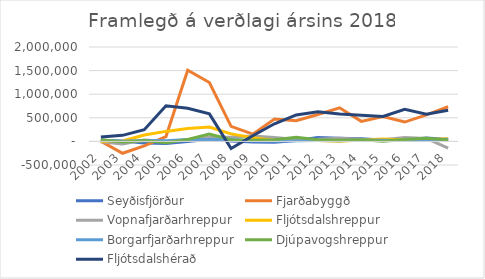
| Category | Seyðisfjörður | Fjarðabyggð | Vopnafjarðarhreppur | Fljótsdalshreppur | Borgarfjarðarhreppur | Djúpavogshreppur | Fljótsdalshérað |
|---|---|---|---|---|---|---|---|
| 2002.0 | 17354.318 | 4823.822 | -6658.55 | 2231.094 | 23784.038 | 35180.598 | 95485.526 |
| 2003.0 | 6314.777 | -251054.402 | -54485.96 | 10732.72 | 5642.481 | -10036.414 | 127752.179 |
| 2004.0 | -34464.767 | -95209.453 | 29319.673 | 135476.506 | 18380.046 | 16348.373 | 246776.496 |
| 2005.0 | -45670.043 | 102176.288 | -4628.116 | 212032.567 | 15030.199 | -26170.098 | 753470.011 |
| 2006.0 | -2495.641 | 1507216.973 | 27265.312 | 271005.652 | 38040.198 | 39319.432 | 702086.592 |
| 2007.0 | 45061.258 | 1248175.918 | 87415.651 | 304875.521 | 32723.334 | 156966.651 | 582424.823 |
| 2008.0 | 8624.498 | 319937.093 | 92235.568 | 158810.484 | 39213.013 | 37174.764 | -150115.039 |
| 2009.0 | -13492.224 | 152802.77 | 115450.043 | 79820.963 | 14912.319 | 23816.95 | 120449.411 |
| 2010.0 | -16789.533 | 475584.059 | 80211.093 | 21570.443 | 6890.871 | 36063.436 | 372676.794 |
| 2011.0 | 19257.655 | 439567.752 | 39129.417 | 34905.328 | 13421.034 | 89749.093 | 561248.728 |
| 2012.0 | 83760.812 | 570577.679 | 45914.996 | 20748.175 | 16708.434 | 35924.965 | 628655.399 |
| 2013.0 | 65317.303 | 710812.617 | 65024.168 | 5073.659 | 12141.959 | 23129.01 | 580381.884 |
| 2014.0 | 54868.688 | 423806.422 | 43473.307 | 29662.983 | 28196.304 | 37479.149 | 555195.129 |
| 2015.0 | 30674.56 | 525218.554 | 36386.125 | 50199.081 | 23278.747 | 5198.321 | 526526.636 |
| 2016.0 | 37039.088 | 409906.131 | 81902.657 | 29757.899 | 21194.746 | 41485.742 | 677833.795 |
| 2017.0 | 74310.008 | 563535.186 | 62267.561 | 36817.241 | 16714.67 | 64315.701 | 575237.816 |
| 2018.0 | 41194 | 734620 | -141465 | 56148 | 46589 | 31640 | 659608 |